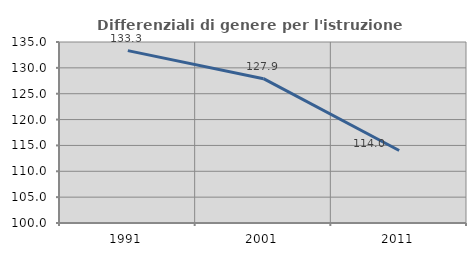
| Category | Differenziali di genere per l'istruzione superiore |
|---|---|
| 1991.0 | 133.33 |
| 2001.0 | 127.907 |
| 2011.0 | 114.016 |